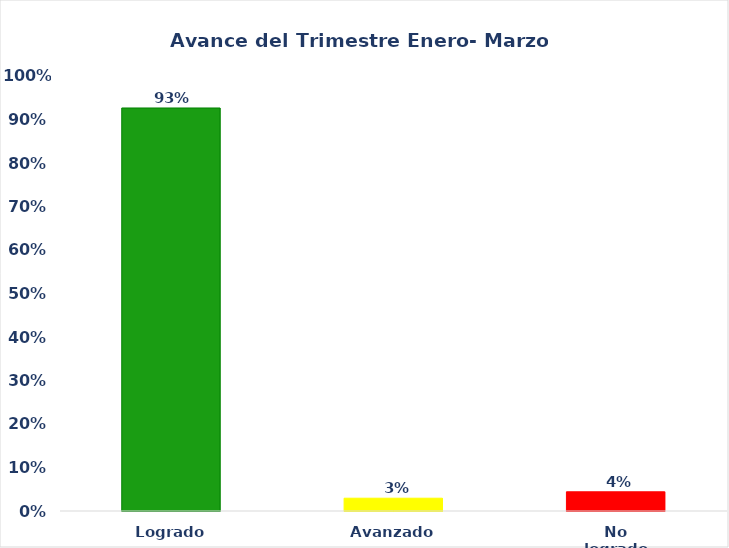
| Category | Series 0 | Series 1 |
|---|---|---|
| Logrado | 0.926 |  |
| Avanzado | 0.029 |  |
| No logrado | 0.044 |  |